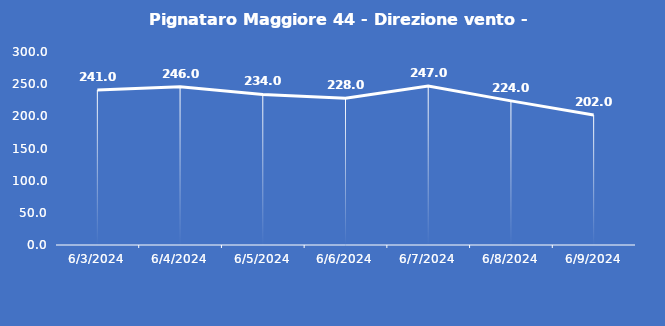
| Category | Pignataro Maggiore 44 - Direzione vento - Grezzo (°N) |
|---|---|
| 6/3/24 | 241 |
| 6/4/24 | 246 |
| 6/5/24 | 234 |
| 6/6/24 | 228 |
| 6/7/24 | 247 |
| 6/8/24 | 224 |
| 6/9/24 | 202 |